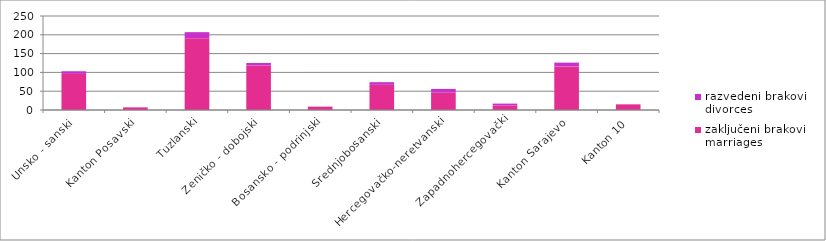
| Category | zaključeni brakovi
marriages | razvedeni brakovi
divorces |
|---|---|---|
| Unsko - sanski | 96 | 7 |
| Kanton Posavski | 7 | 0 |
| Tuzlanski | 191 | 16 |
| Zeničko - dobojski | 118 | 7 |
| Bosansko - podrinjski | 9 | 0 |
| Srednjobosanski | 67 | 7 |
| Hercegovačko-neretvanski | 46 | 10 |
| Zapadnohercegovački | 12 | 5 |
| Kanton Sarajevo | 116 | 10 |
| Kanton 10 | 15 | 0 |